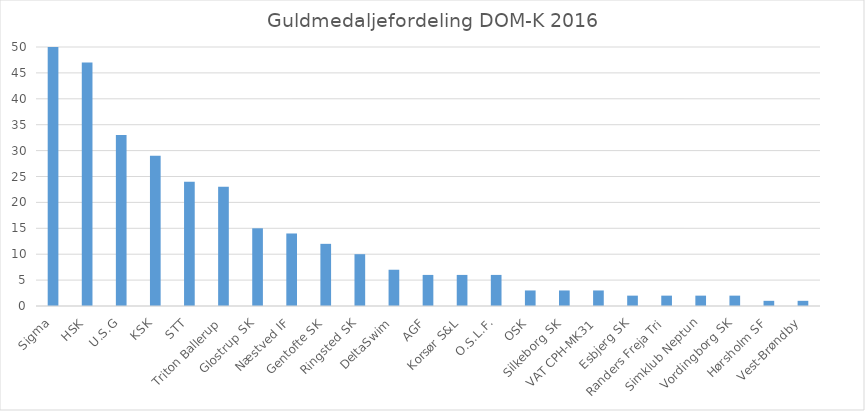
| Category | Medaljer |
|---|---|
| Sigma | 50 |
| HSK | 47 |
| U.S.G | 33 |
| KSK | 29 |
| STT | 24 |
| Triton Ballerup | 23 |
| Glostrup SK | 15 |
| Næstved IF | 14 |
| Gentofte SK | 12 |
| Ringsted SK | 10 |
| DeltaSwim | 7 |
| AGF | 6 |
| Korsør S&L | 6 |
| O.S.L.F. | 6 |
| OSK | 3 |
| Silkeborg SK | 3 |
| VAT CPH-MK31 | 3 |
| Esbjerg SK | 2 |
| Randers Freja Tri | 2 |
| Simklub Neptun | 2 |
| Vordingborg SK | 2 |
| Hørsholm SF | 1 |
| Vest-Brøndby | 1 |